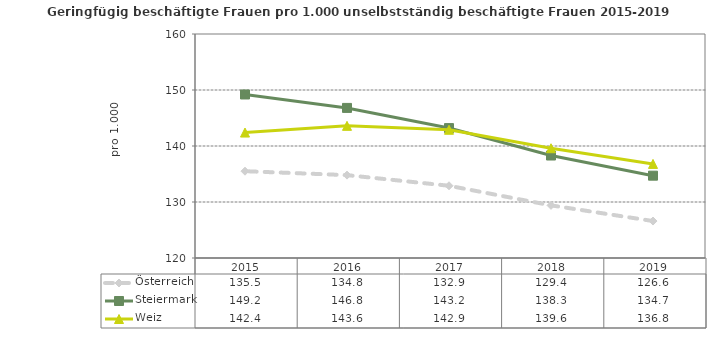
| Category | Österreich | Steiermark | Weiz |
|---|---|---|---|
| 2019.0 | 126.6 | 134.7 | 136.8 |
| 2018.0 | 129.4 | 138.3 | 139.6 |
| 2017.0 | 132.9 | 143.2 | 142.9 |
| 2016.0 | 134.8 | 146.8 | 143.6 |
| 2015.0 | 135.5 | 149.2 | 142.4 |